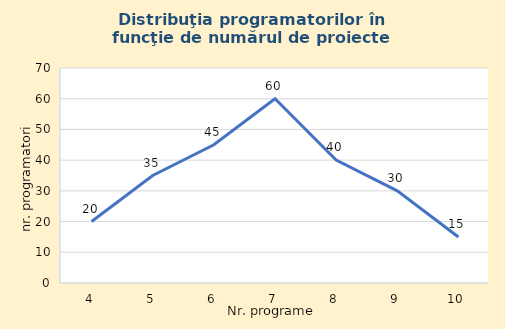
| Category | Nr. programatori |
|---|---|
| 4.0 | 20 |
| 5.0 | 35 |
| 6.0 | 45 |
| 7.0 | 60 |
| 8.0 | 40 |
| 9.0 | 30 |
| 10.0 | 15 |